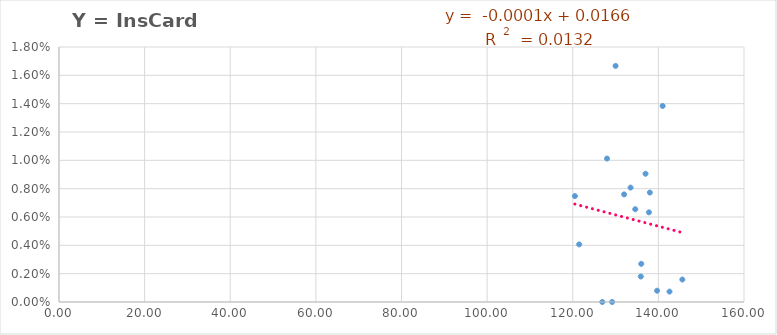
| Category | Y = InsCard /año |
|---|---|
| 139.7 | 0.001 |
| 132.0 | 0.008 |
| 128.0 | 0.01 |
| 135.9 | 0.002 |
| 136.0 | 0.003 |
| 120.5 | 0.007 |
| 130.0 | 0.017 |
| 121.5 | 0.004 |
| 126.9 | 0 |
| 142.6 | 0.001 |
| 138.0 | 0.008 |
| 137.0 | 0.009 |
| 145.6 | 0.002 |
| 137.8 | 0.006 |
| 133.5 | 0.008 |
| 141.0 | 0.014 |
| 134.6 | 0.007 |
| 129.2 | 0 |